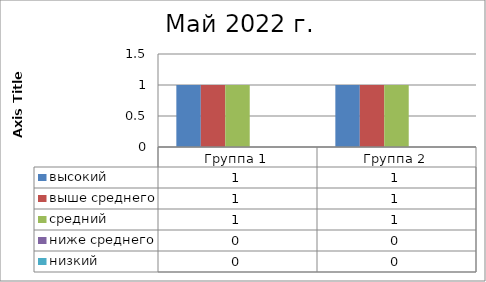
| Category | высокий | выше среднего | средний | ниже среднего | низкий |
|---|---|---|---|---|---|
| Группа 1 | 1 | 1 | 1 | 0 | 0 |
| Группа 2 | 1 | 1 | 1 | 0 | 0 |